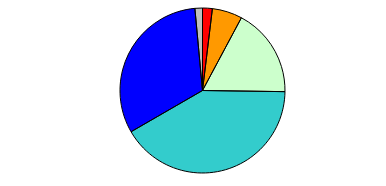
| Category | Series 0 |
|---|---|
| 0 | 13 |
| 1 | 40 |
| 2 | 118 |
| 3 | 281 |
| 4 | 216 |
| 5 | 10 |